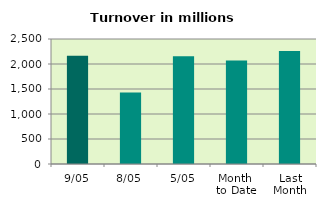
| Category | Series 0 |
|---|---|
| 9/05 | 2164.25 |
| 8/05 | 1431.234 |
| 5/05 | 2156.109 |
| Month 
to Date | 2071.196 |
| Last
Month | 2261.282 |